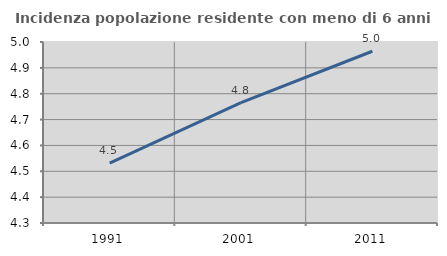
| Category | Incidenza popolazione residente con meno di 6 anni |
|---|---|
| 1991.0 | 4.531 |
| 2001.0 | 4.766 |
| 2011.0 | 4.964 |